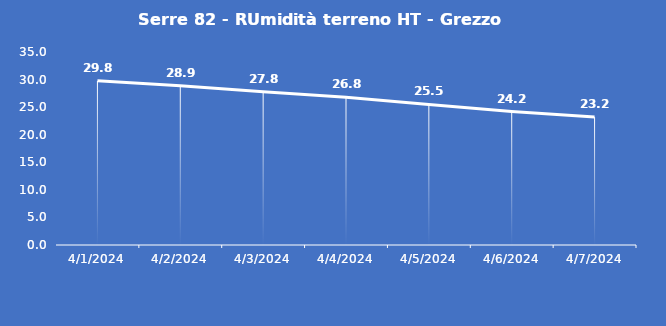
| Category | Serre 82 - RUmidità terreno HT - Grezzo (%VWC) |
|---|---|
| 4/1/24 | 29.8 |
| 4/2/24 | 28.9 |
| 4/3/24 | 27.8 |
| 4/4/24 | 26.8 |
| 4/5/24 | 25.5 |
| 4/6/24 | 24.2 |
| 4/7/24 | 23.2 |